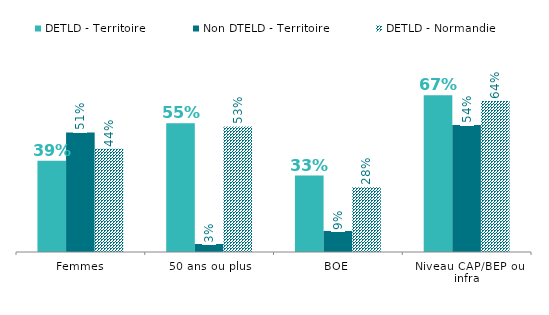
| Category | DETLD - Territoire | Non DTELD - Territoire | DETLD - Normandie |
|---|---|---|---|
| Femmes | 0.388 | 0.509 | 0.44 |
| 50 ans ou plus | 0.548 | 0.034 | 0.534 |
| BOE | 0.325 | 0.09 | 0.276 |
| Niveau CAP/BEP ou infra | 0.667 | 0.54 | 0.642 |